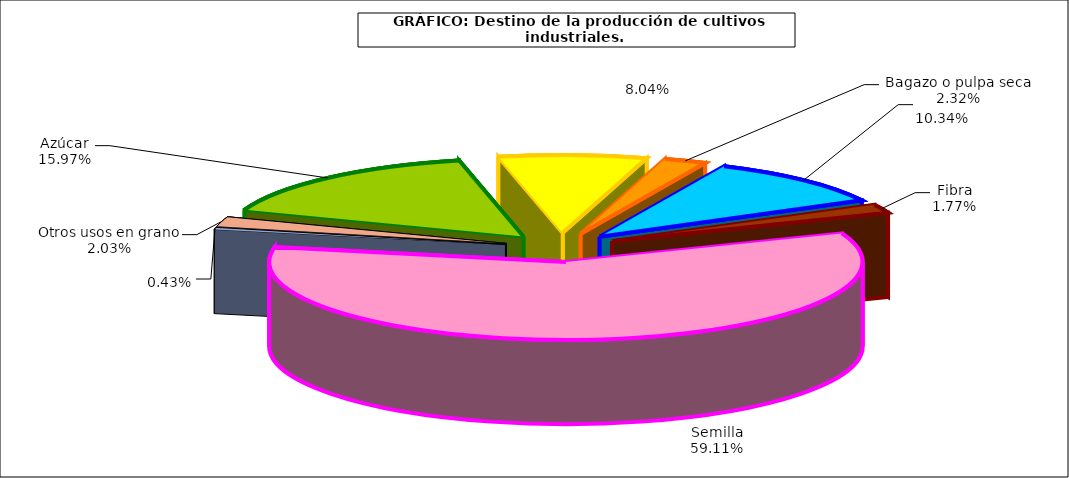
| Category | Series 0 |
|---|---|
|  Azúcar  | 279053 |
|  Bagazo o pulpa seca  | 140603 |
| Fibra | 40549 |
| Semilla | 180782 |
| Otros usos en grano | 30858 |
| Molturación | 1033112 |
| Pimentón | 7453 |
| Bio-combustible  | 35407 |